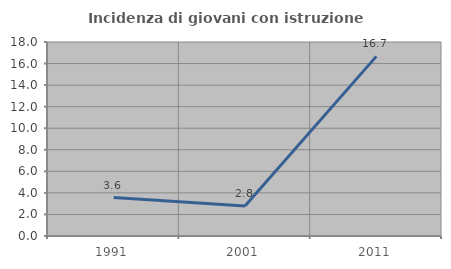
| Category | Incidenza di giovani con istruzione universitaria |
|---|---|
| 1991.0 | 3.571 |
| 2001.0 | 2.778 |
| 2011.0 | 16.667 |